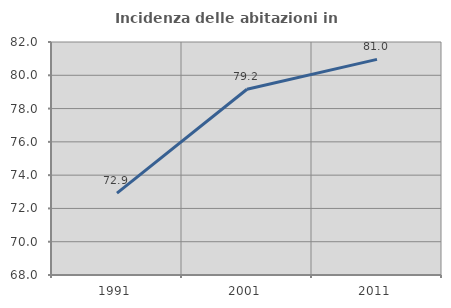
| Category | Incidenza delle abitazioni in proprietà  |
|---|---|
| 1991.0 | 72.924 |
| 2001.0 | 79.158 |
| 2011.0 | 80.957 |